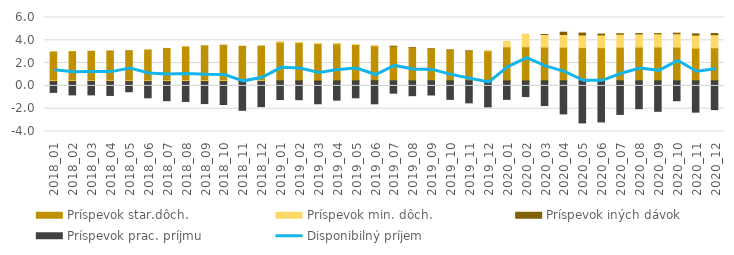
| Category | Príspevok star.dôch. | Príspevok min. dôch. | Príspevok iných dávok | Príspevok prac. príjmu |
|---|---|---|---|---|
| 0 | 2.282 | -0.045 | -0.058 | -0.812 |
| 1 | 2.306 | -0.046 | -0.054 | -1.009 |
| 2 | 2.335 | -0.045 | -0.032 | -1.032 |
| 3 | 2.363 | -0.046 | -0.032 | -1.075 |
| 4 | 2.386 | -0.048 | -0.039 | -0.773 |
| 5 | 2.435 | -0.049 | -0.034 | -1.255 |
| 6 | 2.56 | -0.051 | -0.03 | -1.487 |
| 7 | 2.679 | -0.053 | -0.028 | -1.546 |
| 8 | 2.769 | -0.054 | -0.027 | -1.714 |
| 9 | 2.816 | -0.054 | -0.026 | -1.789 |
| 10 | 2.73 | -0.054 | -0.034 | -2.241 |
| 11 | 2.748 | -0.055 | -0.018 | -1.96 |
| 12 | 3.053 | 0.004 | -0.018 | -1.456 |
| 13 | 3.019 | 0.004 | -0.024 | -1.467 |
| 14 | 2.937 | 0.004 | -0.046 | -1.763 |
| 15 | 2.924 | 0.004 | -0.026 | -1.5 |
| 16 | 2.863 | 0.004 | -0.022 | -1.315 |
| 17 | 2.763 | 0.005 | -0.011 | -1.802 |
| 18 | 2.72 | 0.005 | 0.001 | -0.972 |
| 19 | 2.604 | 0.006 | 0.001 | -1.174 |
| 20 | 2.507 | 0.006 | 0.012 | -1.12 |
| 21 | 2.421 | 0.005 | 0.003 | -1.465 |
| 22 | 2.348 | 0.006 | 0.006 | -1.74 |
| 23 | 2.359 | 0.006 | -0.01 | -2.044 |
| 24 | 2.685 | 0.431 | -0.029 | -1.433 |
| 25 | 2.693 | 0.99 | -0.032 | -1.209 |
| 26 | 2.67 | 0.986 | 0.001 | -1.951 |
| 27 | 2.655 | 1.004 | 0.179 | -2.611 |
| 28 | 2.624 | 0.999 | 0.149 | -3.324 |
| 29 | 2.618 | 1.004 | 0.069 | -3.244 |
| 30 | 2.651 | 1.031 | 0.036 | -2.653 |
| 31 | 2.663 | 1.041 | 0.025 | -2.199 |
| 32 | 2.667 | 1.046 | 0.011 | -2.405 |
| 33 | 2.664 | 1.051 | 0.047 | -1.57 |
| 34 | 2.584 | 1.022 | 0.104 | -2.474 |
| 35 | 2.607 | 1.032 | 0.096 | -2.273 |